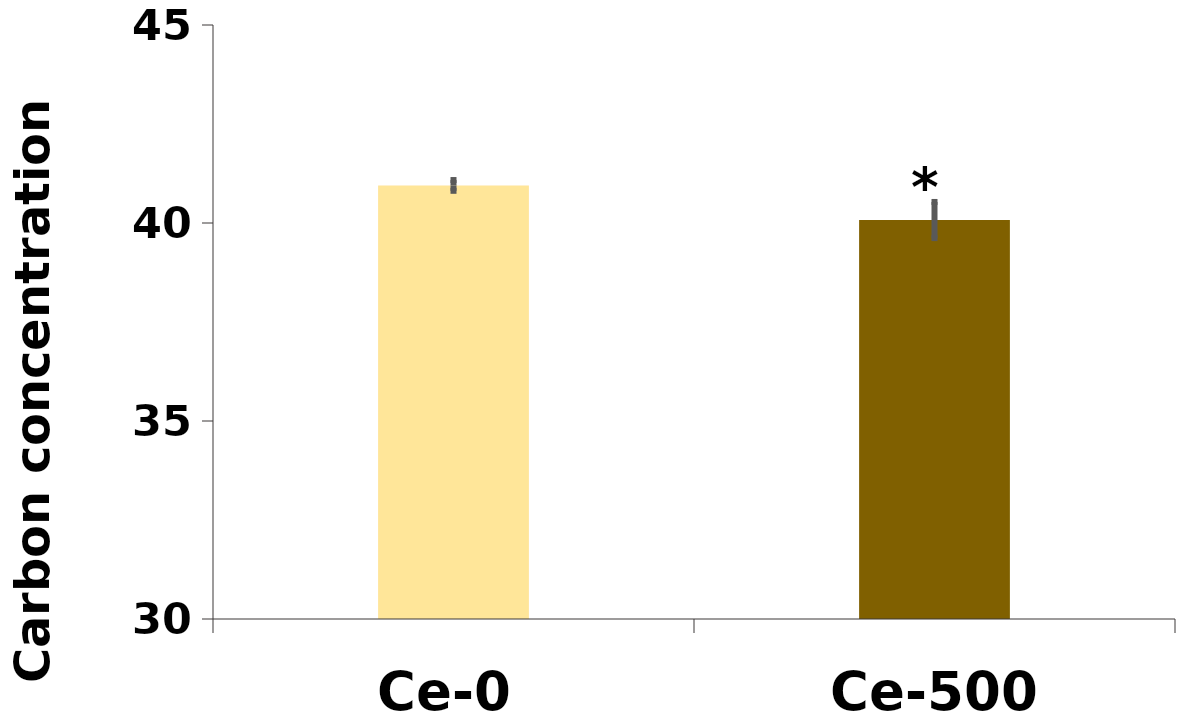
| Category | %C |
|---|---|
| Ce-0 | 40.949 |
| Ce-500 | 40.075 |